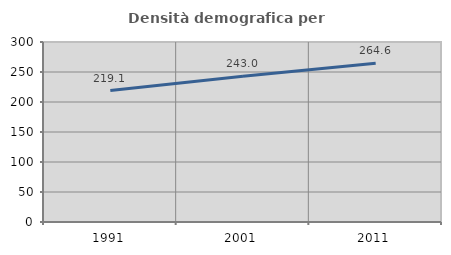
| Category | Densità demografica |
|---|---|
| 1991.0 | 219.087 |
| 2001.0 | 243.005 |
| 2011.0 | 264.622 |